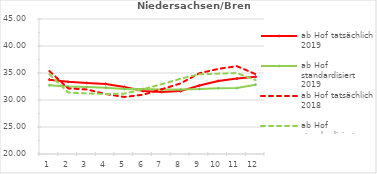
| Category | ab Hof tatsächlich 2019 | ab Hof standardisiert 2019 | ab Hof tatsächlich 2018 | ab Hof standardisiert 2018 |
|---|---|---|---|---|
| 0 | 33.768 | 32.735 | 35.361 | 34.781 |
| 1 | 33.364 | 32.483 | 32.149 | 31.39 |
| 2 | 33.16 | 32.402 | 31.954 | 31.213 |
| 3 | 32.982 | 32.278 | 31.111 | 31.105 |
| 4 | 32.405 | 32.034 | 30.556 | 31.183 |
| 5 | 31.67 | 32.042 | 30.982 | 31.998 |
| 6 | 31.491 | 31.953 | 31.997 | 32.937 |
| 7 | 31.65 | 31.952 | 33.079 | 33.939 |
| 8 | 32.67 | 32.031 | 34.95 | 34.774 |
| 9 | 33.521 | 32.193 | 35.753 | 34.881 |
| 10 | 33.969 | 32.208 | 36.262 | 34.991 |
| 11 | 34.309 | 32.843 | 34.787 | 33.679 |